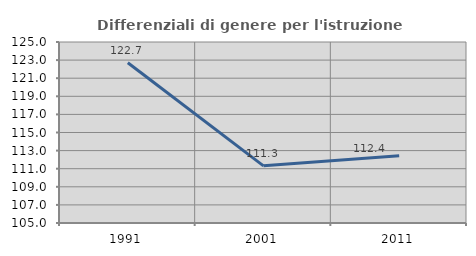
| Category | Differenziali di genere per l'istruzione superiore |
|---|---|
| 1991.0 | 122.702 |
| 2001.0 | 111.314 |
| 2011.0 | 112.424 |